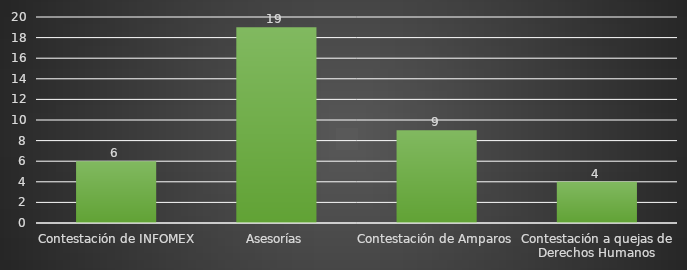
| Category | INDICADOR  |
|---|---|
| Contestación de INFOMEX | 6 |
| Asesorías | 19 |
| Contestación de Amparos | 9 |
| Contestación a quejas de Derechos Humanos | 4 |